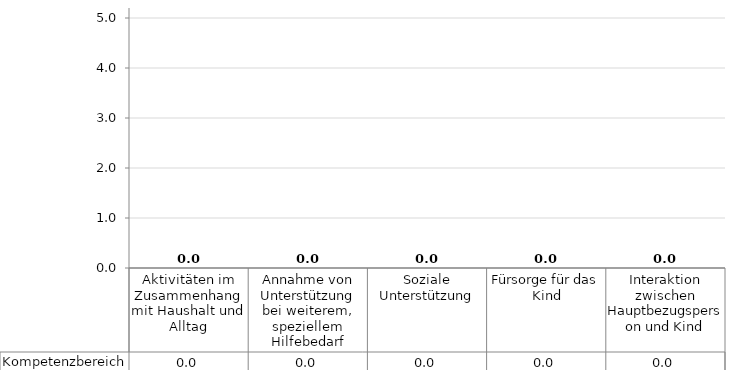
| Category | Kompetenzbereich |
|---|---|
| Aktivitäten im Zusammenhang mit Haushalt und Alltag | 0 |
| Annahme von Unterstützung bei weiterem, speziellem Hilfebedarf | 0 |
| Soziale Unterstützung | 0 |
| Fürsorge für das Kind | 0 |
| Interaktion zwischen Hauptbezugsperson und Kind | 0 |